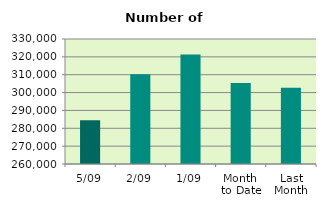
| Category | Series 0 |
|---|---|
| 5/09 | 284518 |
| 2/09 | 310262 |
| 1/09 | 321382 |
| Month 
to Date | 305387.333 |
| Last
Month | 302693.565 |